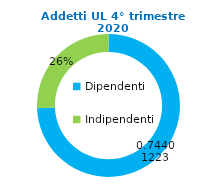
| Category | Series 0 |
|---|---|
| Dipendenti | 56940 |
| Indipendenti | 19591 |